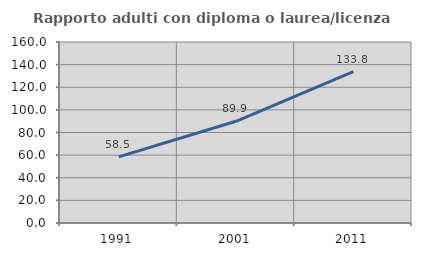
| Category | Rapporto adulti con diploma o laurea/licenza media  |
|---|---|
| 1991.0 | 58.468 |
| 2001.0 | 89.914 |
| 2011.0 | 133.787 |